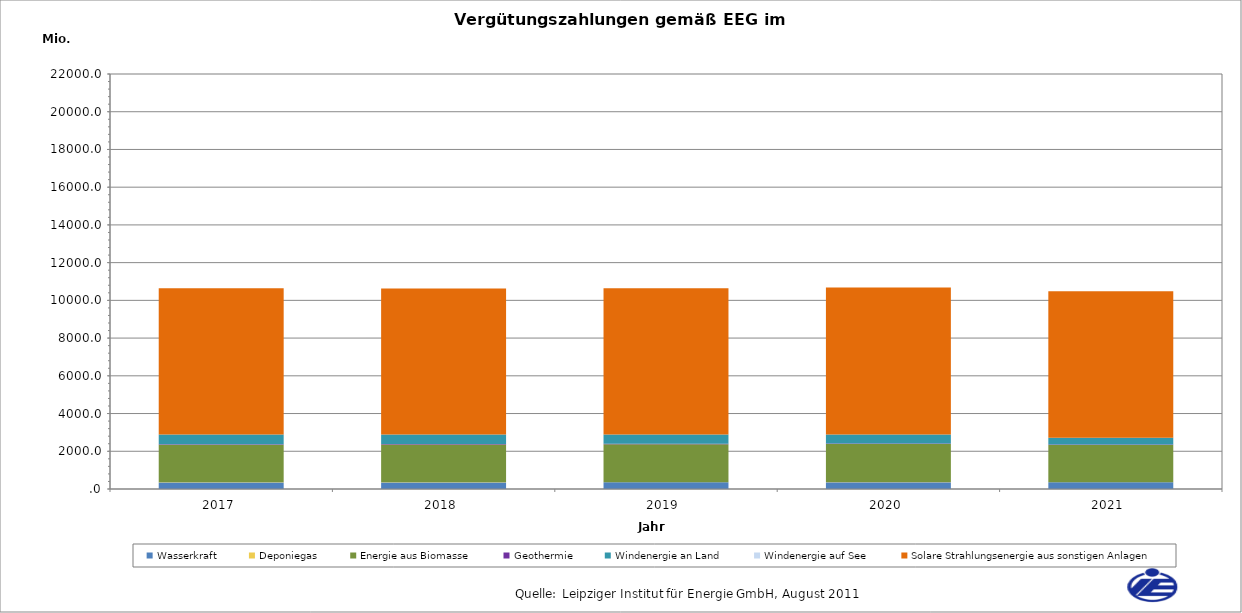
| Category | Wasserkraft | Deponiegas | Energie aus Biomasse | Geothermie | Windenergie an Land | Windenergie auf See | Solare Strahlungsenergie aus sonstigen Anlagen |
|---|---|---|---|---|---|---|---|
| 2017.0 | 348.919 | 13.647 | 1985.066 | 20.371 | 519.152 | 0 | 7749.678 |
| 2018.0 | 350.242 | 12.89 | 1998.415 | 24.312 | 502.827 | 0 | 7742.638 |
| 2019.0 | 351.461 | 12.226 | 2009.449 | 24.312 | 491.039 | 0 | 7750.055 |
| 2020.0 | 353.792 | 11.653 | 2023.686 | 26.813 | 478.954 | 0 | 7784.906 |
| 2021.0 | 353.34 | 4.696 | 1971.338 | 26.743 | 354.513 | 0 | 7776.428 |